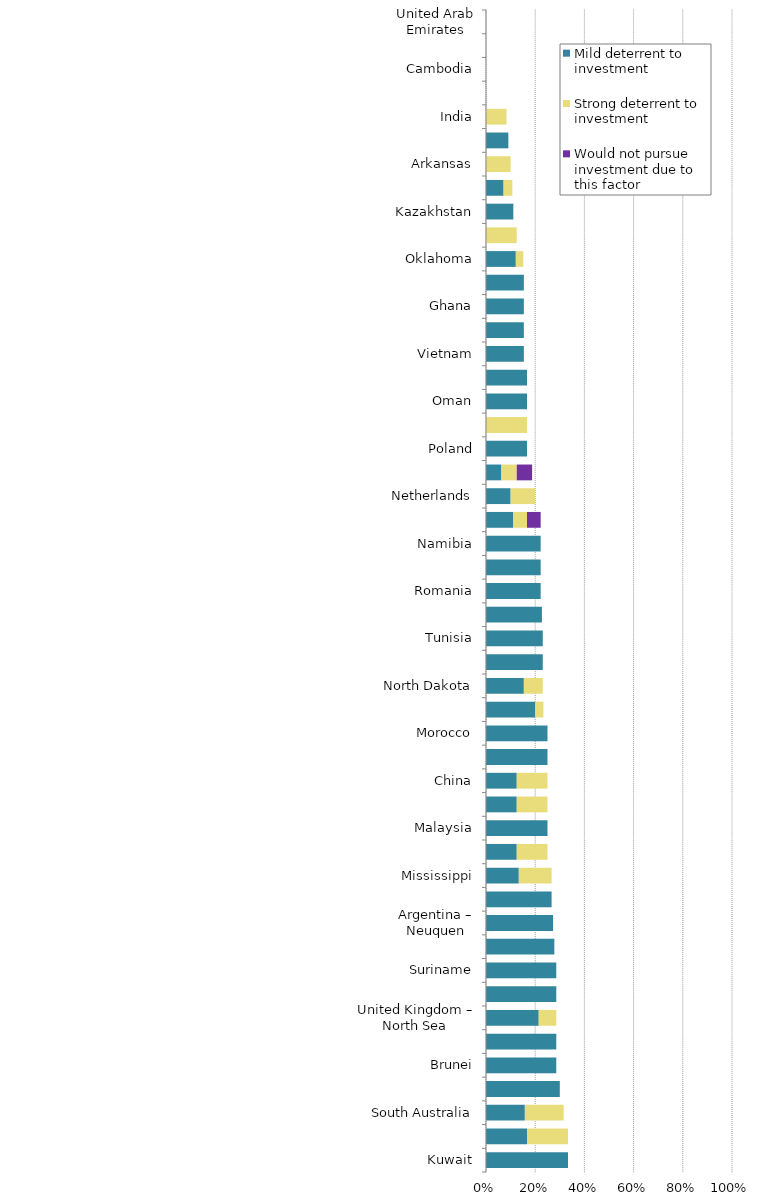
| Category | Mild deterrent to investment | Strong deterrent to investment | Would not pursue investment due to this factor |
|---|---|---|---|
| Kuwait | 0.333 | 0 | 0 |
| Argentina – Santa Cruz | 0.167 | 0.167 | 0 |
| South Australia | 0.158 | 0.158 | 0 |
| Myanmar | 0.3 | 0 | 0 |
| Brunei | 0.286 | 0 | 0 |
| Norway – Other Offshore (ex. Nth. Sea) | 0.286 | 0 | 0 |
| United Kingdom – North Sea | 0.214 | 0.071 | 0 |
| Guyana | 0.286 | 0 | 0 |
| Suriname | 0.286 | 0 | 0 |
| Egypt | 0.278 | 0 | 0 |
| Argentina – Neuquen | 0.273 | 0 | 0 |
| Manitoba | 0.267 | 0 | 0 |
| Mississippi | 0.133 | 0.133 | 0 |
| Alabama | 0.125 | 0.125 | 0 |
| Malaysia | 0.25 | 0 | 0 |
| UK – Other Offshore (ex. Nth. Sea) | 0.125 | 0.125 | 0 |
| China | 0.125 | 0.125 | 0 |
| Mozambique | 0.25 | 0 | 0 |
| Morocco | 0.25 | 0 | 0 |
| Saskatchewan | 0.2 | 0.033 | 0 |
| North Dakota | 0.154 | 0.077 | 0 |
| Angola | 0.231 | 0 | 0 |
| Tunisia | 0.231 | 0 | 0 |
| Nigeria | 0.227 | 0 | 0 |
| Romania | 0.222 | 0 | 0 |
| Kenya | 0.222 | 0 | 0 |
| Namibia | 0.222 | 0 | 0 |
| Mexico | 0.111 | 0.056 | 0.056 |
| Netherlands | 0.1 | 0.1 | 0 |
| Kansas | 0.062 | 0.062 | 0.062 |
| Poland | 0.167 | 0 | 0 |
| South Africa | 0 | 0.167 | 0 |
| Oman | 0.167 | 0 | 0 |
| Yemen | 0.167 | 0 | 0 |
| Vietnam | 0.154 | 0 | 0 |
| Gabon | 0.154 | 0 | 0 |
| Ghana | 0.154 | 0 | 0 |
| Algeria | 0.154 | 0 | 0 |
| Oklahoma | 0.121 | 0.03 | 0 |
| Newfoundland & Labrador | 0 | 0.125 | 0 |
| Kazakhstan | 0.111 | 0 | 0 |
| Texas | 0.071 | 0.036 | 0 |
| Arkansas | 0 | 0.1 | 0 |
| Equatorial Guinea | 0.091 | 0 | 0 |
| India | 0 | 0.083 | 0 |
| Bangladesh | 0 | 0 | 0 |
| Cambodia | 0 | 0 | 0 |
| Ivory Coast | 0 | 0 | 0 |
| United Arab Emirates | 0 | 0 | 0 |